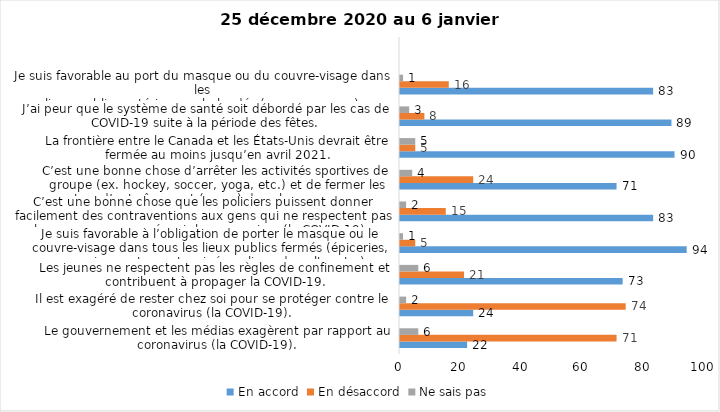
| Category | En accord | En désaccord | Ne sais pas |
|---|---|---|---|
| Le gouvernement et les médias exagèrent par rapport au coronavirus (la COVID-19). | 22 | 71 | 6 |
| Il est exagéré de rester chez soi pour se protéger contre le coronavirus (la COVID-19). | 24 | 74 | 2 |
| Les jeunes ne respectent pas les règles de confinement et contribuent à propager la COVID-19. | 73 | 21 | 6 |
| Je suis favorable à l’obligation de porter le masque ou le couvre-visage dans tous les lieux publics fermés (épiceries, magasins, restaurants, cinéma, lieux de culte, etc.). | 94 | 5 | 1 |
| C’est une bonne chose que les policiers puissent donner facilement des contraventions aux gens qui ne respectent pas les mesures pour prévenir le coronavirus (la COVID-19). | 83 | 15 | 2 |
| C’est une bonne chose d’arrêter les activités sportives de groupe (ex. hockey, soccer, yoga, etc.) et de fermer les centres d’entraînement (gyms) dans les zones rouges. | 71 | 24 | 4 |
| La frontière entre le Canada et les États-Unis devrait être fermée au moins jusqu’en avril 2021. | 90 | 5 | 5 |
| J’ai peur que le système de santé soit débordé par les cas de COVID-19 suite à la période des fêtes. | 89 | 8 | 3 |
| Je suis favorable au port du masque ou du couvre-visage dans les
lieux publics extérieurs achalandés (ex. rues, parcs) | 83 | 16 | 1 |